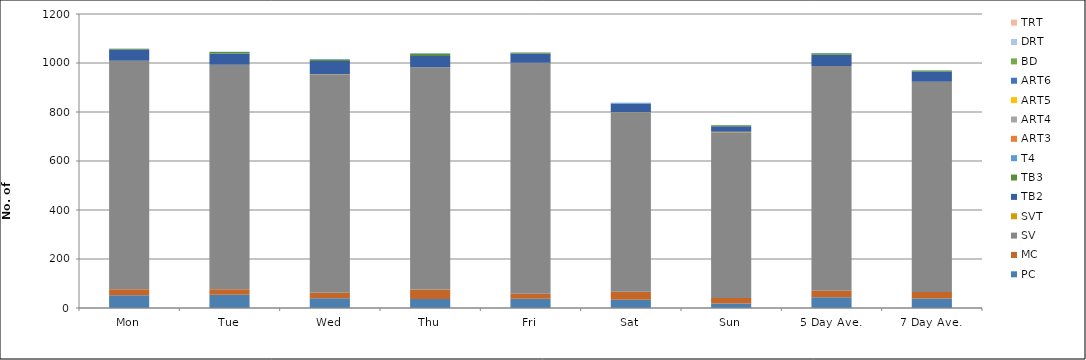
| Category | PC | MC | SV | SVT | TB2 | TB3 | T4 | ART3 | ART4 | ART5 | ART6 | BD | DRT | TRT |
|---|---|---|---|---|---|---|---|---|---|---|---|---|---|---|
| Mon | 52 | 25 | 931 | 1 | 45 | 3 | 1 | 0 | 1 | 0 | 0 | 0 | 0 | 0 |
| Tue | 54 | 23 | 916 | 0 | 46 | 6 | 1 | 0 | 0 | 0 | 0 | 0 | 0 | 0 |
| Wed | 40 | 22 | 891 | 1 | 54 | 6 | 2 | 0 | 0 | 0 | 0 | 0 | 0 | 0 |
| Thu | 37 | 39 | 907 | 0 | 46 | 9 | 1 | 0 | 0 | 0 | 1 | 0 | 0 | 0 |
| Fri | 38 | 20 | 943 | 0 | 38 | 4 | 0 | 0 | 0 | 0 | 0 | 0 | 0 | 0 |
| Sat | 34 | 32 | 732 | 1 | 35 | 0 | 4 | 0 | 0 | 0 | 0 | 0 | 0 | 0 |
| Sun | 18 | 23 | 676 | 2 | 23 | 4 | 0 | 0 | 0 | 0 | 0 | 0 | 0 | 0 |
| 5 Day Ave. | 44 | 26 | 918 | 0 | 46 | 6 | 1 | 0 | 0 | 0 | 0 | 0 | 0 | 0 |
| 7 Day Ave. | 39 | 26 | 857 | 1 | 41 | 5 | 1 | 0 | 0 | 0 | 0 | 0 | 0 | 0 |